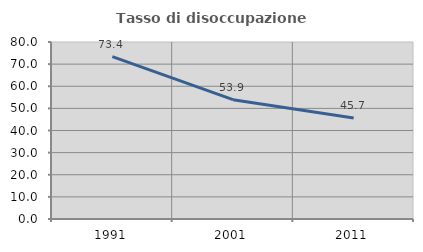
| Category | Tasso di disoccupazione giovanile  |
|---|---|
| 1991.0 | 73.429 |
| 2001.0 | 53.939 |
| 2011.0 | 45.652 |